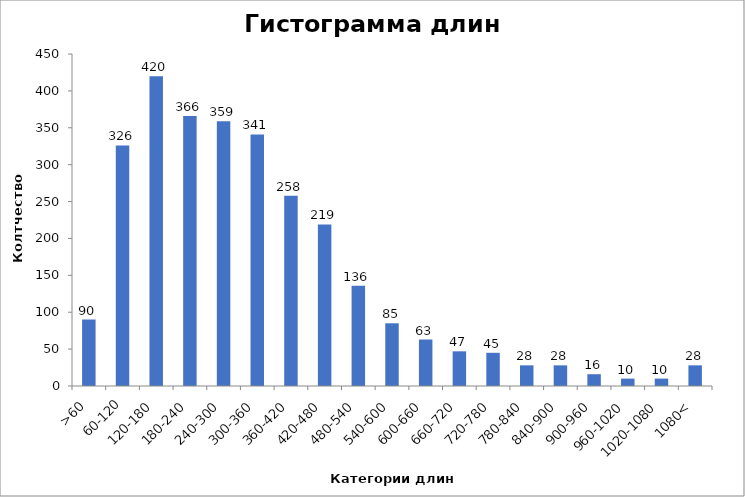
| Category | Частота |
|---|---|
| >60 | 90 |
| 60-120 | 326 |
| 120-180 | 420 |
| 180-240 | 366 |
| 240-300 | 359 |
| 300-360 | 341 |
| 360-420 | 258 |
| 420-480 | 219 |
| 480-540 | 136 |
| 540-600 | 85 |
| 600-660 | 63 |
| 660-720 | 47 |
| 720-780 | 45 |
| 780-840 | 28 |
| 840-900 | 28 |
| 900-960 | 16 |
| 960-1020 | 10 |
| 1020-1080 | 10 |
| 1080< | 28 |